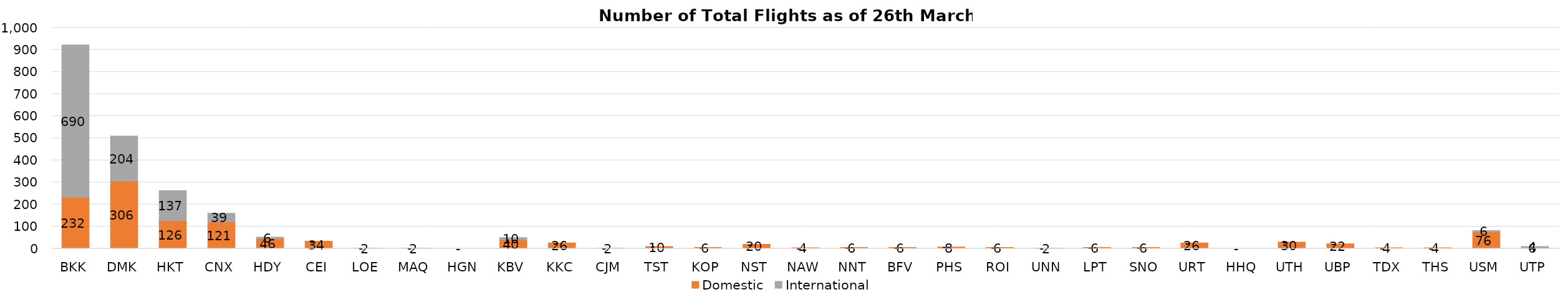
| Category | Domestic | International |
|---|---|---|
| BKK | 232 | 690 |
| DMK | 306 | 204 |
| HKT | 126 | 137 |
| CNX | 121 | 39 |
| HDY | 46 | 6 |
| CEI | 34 | 0 |
| LOE | 2 | 0 |
| MAQ | 2 | 0 |
| HGN | 0 | 0 |
| KBV | 40 | 10 |
| KKC | 26 | 0 |
| CJM | 2 | 0 |
| TST | 10 | 0 |
| KOP | 6 | 0 |
| NST | 20 | 0 |
| NAW | 4 | 0 |
| NNT | 6 | 0 |
| BFV | 6 | 0 |
| PHS | 8 | 0 |
| ROI | 6 | 0 |
| UNN | 2 | 0 |
| LPT | 6 | 0 |
| SNO | 6 | 0 |
| URT | 26 | 0 |
| HHQ | 0 | 0 |
| UTH | 30 | 0 |
| UBP | 22 | 0 |
| TDX | 4 | 0 |
| THS | 4 | 0 |
| USM | 76 | 6 |
| UTP | 6 | 4 |